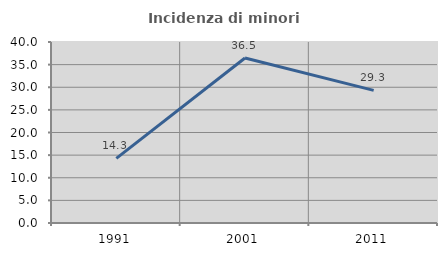
| Category | Incidenza di minori stranieri |
|---|---|
| 1991.0 | 14.286 |
| 2001.0 | 36.471 |
| 2011.0 | 29.302 |